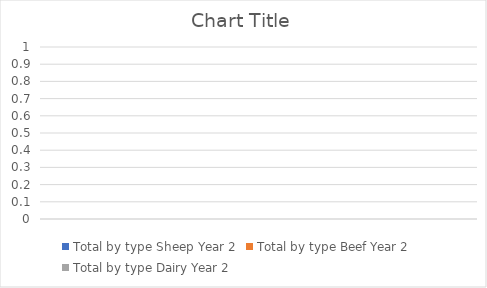
| Category | Series 0 | Series 1 | Series 2 |
|---|---|---|---|
|  | 0 | 0 | 0 |
|  | 0 | 0 | 0 |
|  | 0 | 0 | 0 |
|  | 0 | 0 | 0 |
|  | 0 | 0 | 0 |